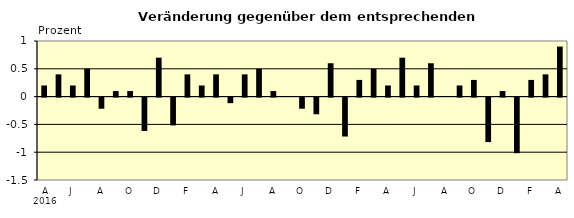
| Category | Series 0 |
|---|---|
| 0 | 0.2 |
| 1 | 0.4 |
| 2 | 0.2 |
| 3 | 0.5 |
| 4 | -0.2 |
| 5 | 0.1 |
| 6 | 0.1 |
| 7 | -0.6 |
| 8 | 0.7 |
| 9 | -0.5 |
| 10 | 0.4 |
| 11 | 0.2 |
| 12 | 0.4 |
| 13 | -0.1 |
| 14 | 0.4 |
| 15 | 0.5 |
| 16 | 0.1 |
| 17 | 0 |
| 18 | -0.2 |
| 19 | -0.3 |
| 20 | 0.6 |
| 21 | -0.7 |
| 22 | 0.3 |
| 23 | 0.5 |
| 24 | 0.2 |
| 25 | 0.7 |
| 26 | 0.2 |
| 27 | 0.6 |
| 28 | 0 |
| 29 | 0.2 |
| 30 | 0.3 |
| 31 | -0.8 |
| 32 | 0.1 |
| 33 | -1 |
| 34 | 0.3 |
| 35 | 0.4 |
| 36 | 0.9 |